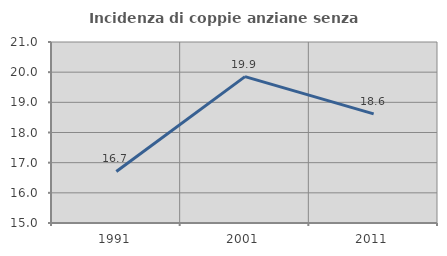
| Category | Incidenza di coppie anziane senza figli  |
|---|---|
| 1991.0 | 16.708 |
| 2001.0 | 19.851 |
| 2011.0 | 18.617 |